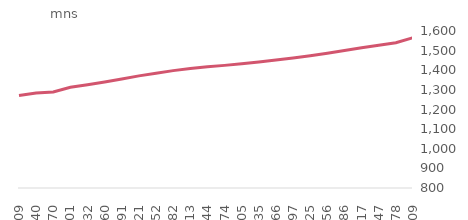
| Category | total |
|---|---|
| 2017-10-01 | 1271208.568 |
| 2017-11-01 | 1283852.169 |
| 2017-12-01 | 1289010.416 |
| 2018-01-01 | 1313425.13 |
| 2018-02-01 | 1326096.664 |
| 2018-03-01 | 1340243.629 |
| 2018-04-01 | 1355532.39 |
| 2018-05-01 | 1371396.977 |
| 2018-06-01 | 1384634.801 |
| 2018-07-01 | 1398070.535 |
| 2018-08-01 | 1409224.64 |
| 2018-09-01 | 1417712.998 |
| 2018-10-01 | 1424848.668 |
| 2018-11-01 | 1432856.692 |
| 2018-12-01 | 1442208.306 |
| 2019-01-01 | 1452345.688 |
| 2019-02-01 | 1462694.571 |
| 2019-03-01 | 1473890.613 |
| 2019-04-01 | 1486809.162 |
| 2019-05-01 | 1500469.743 |
| 2019-06-01 | 1514241.322 |
| 2019-07-01 | 1527820.295 |
| 2019-08-01 | 1539824.126 |
| 2019-09-01 | 1565628.725 |